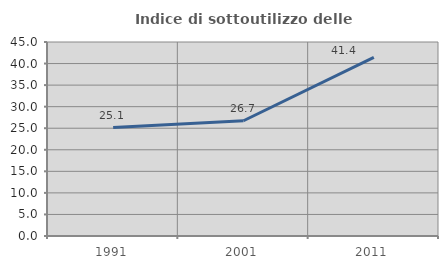
| Category | Indice di sottoutilizzo delle abitazioni  |
|---|---|
| 1991.0 | 25.149 |
| 2001.0 | 26.731 |
| 2011.0 | 41.447 |